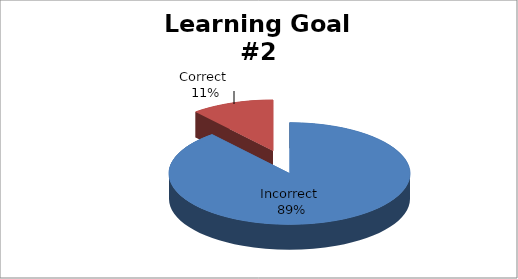
| Category | Series 0 |
|---|---|
| Incorrect  | 16 |
| Correct  | 2 |